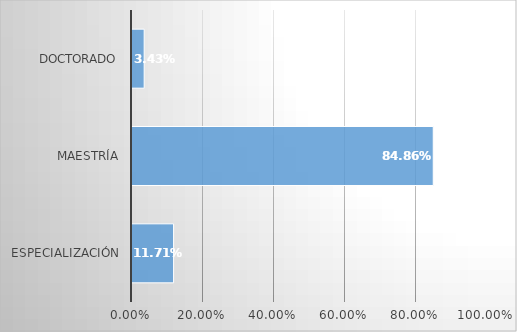
| Category | Series 0 |
|---|---|
| Especialización | 0.117 |
| Maestría | 0.849 |
| Doctorado | 0.034 |